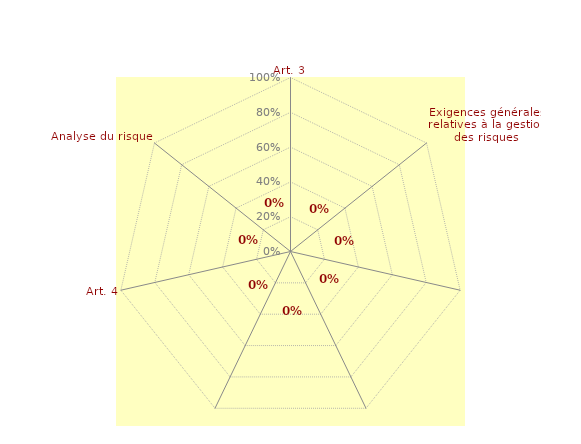
| Category | série2 |
|---|---|
| 0 | 0 |
| 1 | 0 |
| 2 | 0 |
| 3 | 0 |
| 4 | 0 |
| 5 | 0 |
| 6 | 0 |